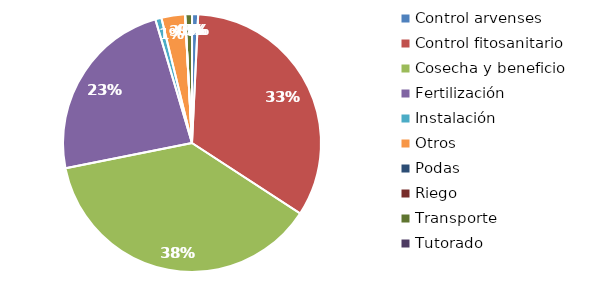
| Category | Valor |
|---|---|
| Control arvenses | 320000 |
| Control fitosanitario | 13990000 |
| Cosecha y beneficio | 15768000 |
| Fertilización | 9852000 |
| Instalación | 322500 |
| Otros | 1240000 |
| Podas | 0 |
| Riego | 0 |
| Transporte | 358600 |
| Tutorado | 0 |